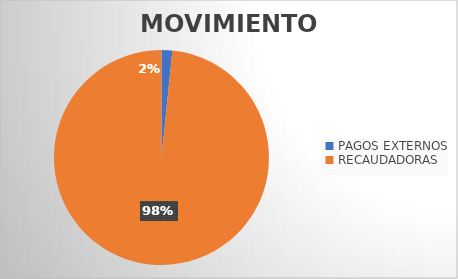
| Category | MOVIMIENTOS |
|---|---|
| PAGOS EXTERNOS | 295 |
| RECAUDADORAS | 17890 |